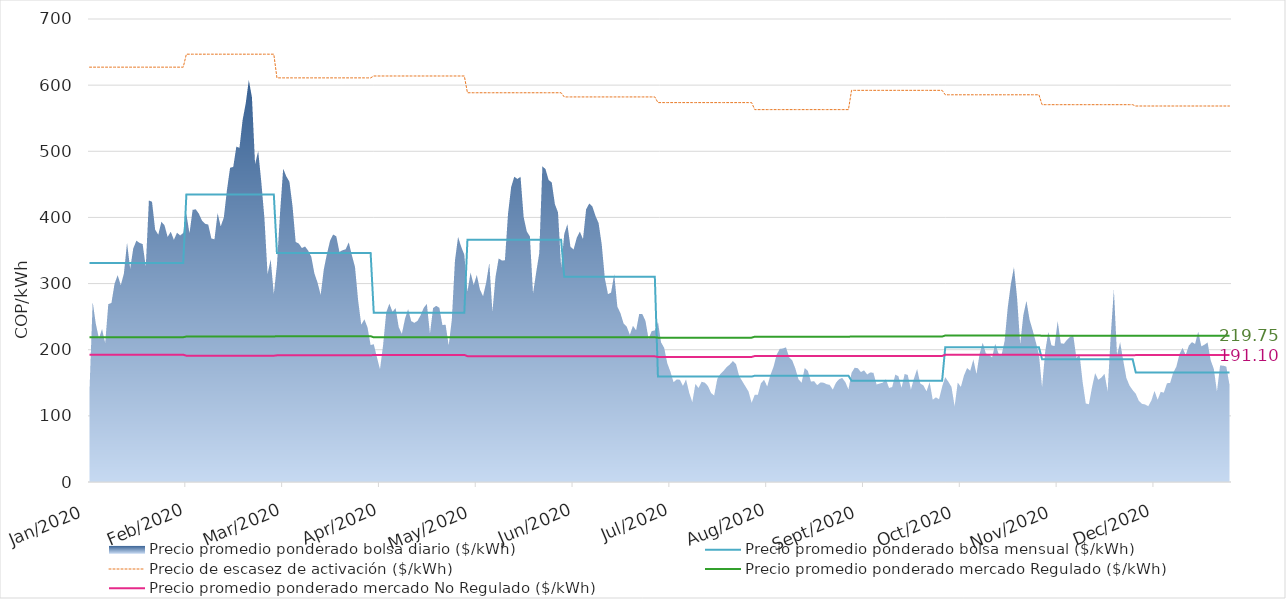
| Category | Precio promedio ponderado bolsa mensual ($/kWh) | Precio de escasez de activación ($/kWh) | Precio promedio ponderado mercado Regulado ($/kWh) | Precio promedio ponderado mercado No Regulado ($/kWh) |
|---|---|---|---|---|
| 2020-01-01 | 331.207 | 627.213 | 218.91 | 192.425 |
| 2020-01-02 | 331.207 | 627.213 | 218.91 | 192.425 |
| 2020-01-03 | 331.207 | 627.213 | 218.91 | 192.425 |
| 2020-01-04 | 331.207 | 627.213 | 218.91 | 192.425 |
| 2020-01-05 | 331.207 | 627.213 | 218.91 | 192.425 |
| 2020-01-06 | 331.207 | 627.213 | 218.91 | 192.425 |
| 2020-01-07 | 331.207 | 627.213 | 218.91 | 192.425 |
| 2020-01-08 | 331.207 | 627.213 | 218.91 | 192.425 |
| 2020-01-09 | 331.207 | 627.213 | 218.91 | 192.425 |
| 2020-01-10 | 331.207 | 627.213 | 218.91 | 192.425 |
| 2020-01-11 | 331.207 | 627.213 | 218.91 | 192.425 |
| 2020-01-12 | 331.207 | 627.213 | 218.91 | 192.425 |
| 2020-01-13 | 331.207 | 627.213 | 218.91 | 192.425 |
| 2020-01-14 | 331.207 | 627.213 | 218.91 | 192.425 |
| 2020-01-15 | 331.207 | 627.213 | 218.91 | 192.425 |
| 2020-01-16 | 331.207 | 627.213 | 218.91 | 192.425 |
| 2020-01-17 | 331.207 | 627.213 | 218.91 | 192.425 |
| 2020-01-18 | 331.207 | 627.213 | 218.91 | 192.425 |
| 2020-01-19 | 331.207 | 627.213 | 218.91 | 192.425 |
| 2020-01-20 | 331.207 | 627.213 | 218.91 | 192.425 |
| 2020-01-21 | 331.207 | 627.213 | 218.91 | 192.425 |
| 2020-01-22 | 331.207 | 627.213 | 218.91 | 192.425 |
| 2020-01-23 | 331.207 | 627.213 | 218.91 | 192.425 |
| 2020-01-24 | 331.207 | 627.213 | 218.91 | 192.425 |
| 2020-01-25 | 331.207 | 627.213 | 218.91 | 192.425 |
| 2020-01-26 | 331.207 | 627.213 | 218.91 | 192.425 |
| 2020-01-27 | 331.207 | 627.213 | 218.91 | 192.425 |
| 2020-01-28 | 331.207 | 627.213 | 218.91 | 192.425 |
| 2020-01-29 | 331.207 | 627.213 | 218.91 | 192.425 |
| 2020-01-30 | 331.207 | 627.213 | 218.91 | 192.425 |
| 2020-01-31 | 331.207 | 627.213 | 218.91 | 192.425 |
| 2020-02-01 | 434.768 | 646.808 | 219.941 | 190.929 |
| 2020-02-02 | 434.768 | 646.808 | 219.941 | 190.929 |
| 2020-02-03 | 434.768 | 646.808 | 219.941 | 190.929 |
| 2020-02-04 | 434.768 | 646.808 | 219.941 | 190.929 |
| 2020-02-05 | 434.768 | 646.808 | 219.941 | 190.929 |
| 2020-02-06 | 434.768 | 646.808 | 219.941 | 190.929 |
| 2020-02-07 | 434.768 | 646.808 | 219.941 | 190.929 |
| 2020-02-08 | 434.768 | 646.808 | 219.941 | 190.929 |
| 2020-02-09 | 434.768 | 646.808 | 219.941 | 190.929 |
| 2020-02-10 | 434.768 | 646.808 | 219.941 | 190.929 |
| 2020-02-11 | 434.768 | 646.808 | 219.941 | 190.929 |
| 2020-02-12 | 434.768 | 646.808 | 219.941 | 190.929 |
| 2020-02-13 | 434.768 | 646.808 | 219.941 | 190.929 |
| 2020-02-14 | 434.768 | 646.808 | 219.941 | 190.929 |
| 2020-02-15 | 434.768 | 646.808 | 219.941 | 190.929 |
| 2020-02-16 | 434.768 | 646.808 | 219.941 | 190.929 |
| 2020-02-17 | 434.768 | 646.808 | 219.941 | 190.929 |
| 2020-02-18 | 434.768 | 646.808 | 219.941 | 190.929 |
| 2020-02-19 | 434.768 | 646.808 | 219.941 | 190.929 |
| 2020-02-20 | 434.768 | 646.808 | 219.941 | 190.929 |
| 2020-02-21 | 434.768 | 646.808 | 219.941 | 190.929 |
| 2020-02-22 | 434.768 | 646.808 | 219.941 | 190.929 |
| 2020-02-23 | 434.768 | 646.808 | 219.941 | 190.929 |
| 2020-02-24 | 434.768 | 646.808 | 219.941 | 190.929 |
| 2020-02-25 | 434.768 | 646.808 | 219.941 | 190.929 |
| 2020-02-26 | 434.768 | 646.808 | 219.941 | 190.929 |
| 2020-02-27 | 434.768 | 646.808 | 219.941 | 190.929 |
| 2020-02-28 | 434.768 | 646.808 | 219.941 | 190.929 |
| 2020-02-29 | 434.768 | 646.808 | 219.941 | 190.929 |
| 2020-03-01 | 346.266 | 610.972 | 220.475 | 191.505 |
| 2020-03-02 | 346.266 | 610.972 | 220.475 | 191.505 |
| 2020-03-03 | 346.266 | 610.972 | 220.475 | 191.505 |
| 2020-03-04 | 346.266 | 610.972 | 220.475 | 191.505 |
| 2020-03-05 | 346.266 | 610.972 | 220.475 | 191.505 |
| 2020-03-06 | 346.266 | 610.972 | 220.475 | 191.505 |
| 2020-03-07 | 346.266 | 610.972 | 220.475 | 191.505 |
| 2020-03-08 | 346.266 | 610.972 | 220.475 | 191.505 |
| 2020-03-09 | 346.266 | 610.972 | 220.475 | 191.505 |
| 2020-03-10 | 346.266 | 610.972 | 220.475 | 191.505 |
| 2020-03-11 | 346.266 | 610.972 | 220.475 | 191.505 |
| 2020-03-12 | 346.266 | 610.972 | 220.475 | 191.505 |
| 2020-03-13 | 346.266 | 610.972 | 220.475 | 191.505 |
| 2020-03-14 | 346.266 | 610.972 | 220.475 | 191.505 |
| 2020-03-15 | 346.266 | 610.972 | 220.475 | 191.505 |
| 2020-03-16 | 346.266 | 610.972 | 220.475 | 191.505 |
| 2020-03-17 | 346.266 | 610.972 | 220.475 | 191.505 |
| 2020-03-18 | 346.266 | 610.972 | 220.475 | 191.505 |
| 2020-03-19 | 346.266 | 610.972 | 220.475 | 191.505 |
| 2020-03-20 | 346.266 | 610.972 | 220.475 | 191.505 |
| 2020-03-21 | 346.266 | 610.972 | 220.475 | 191.505 |
| 2020-03-22 | 346.266 | 610.972 | 220.475 | 191.505 |
| 2020-03-23 | 346.266 | 610.972 | 220.475 | 191.505 |
| 2020-03-24 | 346.266 | 610.972 | 220.475 | 191.505 |
| 2020-03-25 | 346.266 | 610.972 | 220.475 | 191.505 |
| 2020-03-26 | 346.266 | 610.972 | 220.475 | 191.505 |
| 2020-03-27 | 346.266 | 610.972 | 220.475 | 191.505 |
| 2020-03-28 | 346.266 | 610.972 | 220.475 | 191.505 |
| 2020-03-29 | 346.266 | 610.972 | 220.475 | 191.505 |
| 2020-03-30 | 346.266 | 610.972 | 220.475 | 191.505 |
| 2020-03-31 | 346.266 | 610.972 | 220.475 | 191.505 |
| 2020-04-01 | 255.809 | 613.837 | 218.713 | 192.19 |
| 2020-04-02 | 255.809 | 613.837 | 218.713 | 192.19 |
| 2020-04-03 | 255.809 | 613.837 | 218.713 | 192.19 |
| 2020-04-04 | 255.809 | 613.837 | 218.713 | 192.19 |
| 2020-04-05 | 255.809 | 613.837 | 218.713 | 192.19 |
| 2020-04-06 | 255.809 | 613.837 | 218.713 | 192.19 |
| 2020-04-07 | 255.809 | 613.837 | 218.713 | 192.19 |
| 2020-04-08 | 255.809 | 613.837 | 218.713 | 192.19 |
| 2020-04-09 | 255.809 | 613.837 | 218.713 | 192.19 |
| 2020-04-10 | 255.809 | 613.837 | 218.713 | 192.19 |
| 2020-04-11 | 255.809 | 613.837 | 218.713 | 192.19 |
| 2020-04-12 | 255.809 | 613.837 | 218.713 | 192.19 |
| 2020-04-13 | 255.809 | 613.837 | 218.713 | 192.19 |
| 2020-04-14 | 255.809 | 613.837 | 218.713 | 192.19 |
| 2020-04-15 | 255.809 | 613.837 | 218.713 | 192.19 |
| 2020-04-16 | 255.809 | 613.837 | 218.713 | 192.19 |
| 2020-04-17 | 255.809 | 613.837 | 218.713 | 192.19 |
| 2020-04-18 | 255.809 | 613.837 | 218.713 | 192.19 |
| 2020-04-19 | 255.809 | 613.837 | 218.713 | 192.19 |
| 2020-04-20 | 255.809 | 613.837 | 218.713 | 192.19 |
| 2020-04-21 | 255.809 | 613.837 | 218.713 | 192.19 |
| 2020-04-22 | 255.809 | 613.837 | 218.713 | 192.19 |
| 2020-04-23 | 255.809 | 613.837 | 218.713 | 192.19 |
| 2020-04-24 | 255.809 | 613.837 | 218.713 | 192.19 |
| 2020-04-25 | 255.809 | 613.837 | 218.713 | 192.19 |
| 2020-04-26 | 255.809 | 613.837 | 218.713 | 192.19 |
| 2020-04-27 | 255.809 | 613.837 | 218.713 | 192.19 |
| 2020-04-28 | 255.809 | 613.837 | 218.713 | 192.19 |
| 2020-04-29 | 255.809 | 613.837 | 218.713 | 192.19 |
| 2020-04-30 | 255.809 | 613.837 | 218.713 | 192.19 |
| 2020-05-01 | 366.393 | 588.481 | 218.769 | 190.274 |
| 2020-05-02 | 366.393 | 588.481 | 218.769 | 190.274 |
| 2020-05-03 | 366.393 | 588.481 | 218.769 | 190.274 |
| 2020-05-04 | 366.393 | 588.481 | 218.769 | 190.274 |
| 2020-05-05 | 366.393 | 588.481 | 218.769 | 190.274 |
| 2020-05-06 | 366.393 | 588.481 | 218.769 | 190.274 |
| 2020-05-07 | 366.393 | 588.481 | 218.769 | 190.274 |
| 2020-05-08 | 366.393 | 588.481 | 218.769 | 190.274 |
| 2020-05-09 | 366.393 | 588.481 | 218.769 | 190.274 |
| 2020-05-10 | 366.393 | 588.481 | 218.769 | 190.274 |
| 2020-05-11 | 366.393 | 588.481 | 218.769 | 190.274 |
| 2020-05-12 | 366.393 | 588.481 | 218.769 | 190.274 |
| 2020-05-13 | 366.393 | 588.481 | 218.769 | 190.274 |
| 2020-05-14 | 366.393 | 588.481 | 218.769 | 190.274 |
| 2020-05-15 | 366.393 | 588.481 | 218.769 | 190.274 |
| 2020-05-16 | 366.393 | 588.481 | 218.769 | 190.274 |
| 2020-05-17 | 366.393 | 588.481 | 218.769 | 190.274 |
| 2020-05-18 | 366.393 | 588.481 | 218.769 | 190.274 |
| 2020-05-19 | 366.393 | 588.481 | 218.769 | 190.274 |
| 2020-05-20 | 366.393 | 588.481 | 218.769 | 190.274 |
| 2020-05-21 | 366.393 | 588.481 | 218.769 | 190.274 |
| 2020-05-22 | 366.393 | 588.481 | 218.769 | 190.274 |
| 2020-05-23 | 366.393 | 588.481 | 218.769 | 190.274 |
| 2020-05-24 | 366.393 | 588.481 | 218.769 | 190.274 |
| 2020-05-25 | 366.393 | 588.481 | 218.769 | 190.274 |
| 2020-05-26 | 366.393 | 588.481 | 218.769 | 190.274 |
| 2020-05-27 | 366.393 | 588.481 | 218.769 | 190.274 |
| 2020-05-28 | 366.393 | 588.481 | 218.769 | 190.274 |
| 2020-05-29 | 366.393 | 588.481 | 218.769 | 190.274 |
| 2020-05-30 | 366.393 | 588.481 | 218.769 | 190.274 |
| 2020-05-31 | 366.393 | 588.481 | 218.769 | 190.274 |
| 2020-06-01 | 310.186 | 582.191 | 218.767 | 189.962 |
| 2020-06-02 | 310.186 | 582.191 | 218.767 | 189.962 |
| 2020-06-03 | 310.186 | 582.191 | 218.767 | 189.962 |
| 2020-06-04 | 310.186 | 582.191 | 218.767 | 189.962 |
| 2020-06-05 | 310.186 | 582.191 | 218.767 | 189.962 |
| 2020-06-06 | 310.186 | 582.191 | 218.767 | 189.962 |
| 2020-06-07 | 310.186 | 582.191 | 218.767 | 189.962 |
| 2020-06-08 | 310.186 | 582.191 | 218.767 | 189.962 |
| 2020-06-09 | 310.186 | 582.191 | 218.767 | 189.962 |
| 2020-06-10 | 310.186 | 582.191 | 218.767 | 189.962 |
| 2020-06-11 | 310.186 | 582.191 | 218.767 | 189.962 |
| 2020-06-12 | 310.186 | 582.191 | 218.767 | 189.962 |
| 2020-06-13 | 310.186 | 582.191 | 218.767 | 189.962 |
| 2020-06-14 | 310.186 | 582.191 | 218.767 | 189.962 |
| 2020-06-15 | 310.186 | 582.191 | 218.767 | 189.962 |
| 2020-06-16 | 310.186 | 582.191 | 218.767 | 189.962 |
| 2020-06-17 | 310.186 | 582.191 | 218.767 | 189.962 |
| 2020-06-18 | 310.186 | 582.191 | 218.767 | 189.962 |
| 2020-06-19 | 310.186 | 582.191 | 218.767 | 189.962 |
| 2020-06-20 | 310.186 | 582.191 | 218.767 | 189.962 |
| 2020-06-21 | 310.186 | 582.191 | 218.767 | 189.962 |
| 2020-06-22 | 310.186 | 582.191 | 218.767 | 189.962 |
| 2020-06-23 | 310.186 | 582.191 | 218.767 | 189.962 |
| 2020-06-24 | 310.186 | 582.191 | 218.767 | 189.962 |
| 2020-06-25 | 310.186 | 582.191 | 218.767 | 189.962 |
| 2020-06-26 | 310.186 | 582.191 | 218.767 | 189.962 |
| 2020-06-27 | 310.186 | 582.191 | 218.767 | 189.962 |
| 2020-06-28 | 310.186 | 582.191 | 218.767 | 189.962 |
| 2020-06-29 | 310.186 | 582.191 | 218.767 | 189.962 |
| 2020-06-30 | 310.186 | 582.191 | 218.767 | 189.962 |
| 2020-07-01 | 159.333 | 573.611 | 218.269 | 189.088 |
| 2020-07-02 | 159.333 | 573.611 | 218.269 | 189.088 |
| 2020-07-03 | 159.333 | 573.611 | 218.269 | 189.088 |
| 2020-07-04 | 159.333 | 573.611 | 218.269 | 189.088 |
| 2020-07-05 | 159.333 | 573.611 | 218.269 | 189.088 |
| 2020-07-06 | 159.333 | 573.611 | 218.269 | 189.088 |
| 2020-07-07 | 159.333 | 573.611 | 218.269 | 189.088 |
| 2020-07-08 | 159.333 | 573.611 | 218.269 | 189.088 |
| 2020-07-09 | 159.333 | 573.611 | 218.269 | 189.088 |
| 2020-07-10 | 159.333 | 573.611 | 218.269 | 189.088 |
| 2020-07-11 | 159.333 | 573.611 | 218.269 | 189.088 |
| 2020-07-12 | 159.333 | 573.611 | 218.269 | 189.088 |
| 2020-07-13 | 159.333 | 573.611 | 218.269 | 189.088 |
| 2020-07-14 | 159.333 | 573.611 | 218.269 | 189.088 |
| 2020-07-15 | 159.333 | 573.611 | 218.269 | 189.088 |
| 2020-07-16 | 159.333 | 573.611 | 218.269 | 189.088 |
| 2020-07-17 | 159.333 | 573.611 | 218.269 | 189.088 |
| 2020-07-18 | 159.333 | 573.611 | 218.269 | 189.088 |
| 2020-07-19 | 159.333 | 573.611 | 218.269 | 189.088 |
| 2020-07-20 | 159.333 | 573.611 | 218.269 | 189.088 |
| 2020-07-21 | 159.333 | 573.611 | 218.269 | 189.088 |
| 2020-07-22 | 159.333 | 573.611 | 218.269 | 189.088 |
| 2020-07-23 | 159.333 | 573.611 | 218.269 | 189.088 |
| 2020-07-24 | 159.333 | 573.611 | 218.269 | 189.088 |
| 2020-07-25 | 159.333 | 573.611 | 218.269 | 189.088 |
| 2020-07-26 | 159.333 | 573.611 | 218.269 | 189.088 |
| 2020-07-27 | 159.333 | 573.611 | 218.269 | 189.088 |
| 2020-07-28 | 159.333 | 573.611 | 218.269 | 189.088 |
| 2020-07-29 | 159.333 | 573.611 | 218.269 | 189.088 |
| 2020-07-30 | 159.333 | 573.611 | 218.269 | 189.088 |
| 2020-07-31 | 159.333 | 573.611 | 218.269 | 189.088 |
| 2020-08-01 | 160.719 | 562.998 | 219.631 | 190.429 |
| 2020-08-02 | 160.719 | 562.998 | 219.631 | 190.429 |
| 2020-08-03 | 160.719 | 562.998 | 219.631 | 190.429 |
| 2020-08-04 | 160.719 | 562.998 | 219.631 | 190.429 |
| 2020-08-05 | 160.719 | 562.998 | 219.631 | 190.429 |
| 2020-08-06 | 160.719 | 562.998 | 219.631 | 190.429 |
| 2020-08-07 | 160.719 | 562.998 | 219.631 | 190.429 |
| 2020-08-08 | 160.719 | 562.998 | 219.631 | 190.429 |
| 2020-08-09 | 160.719 | 562.998 | 219.631 | 190.429 |
| 2020-08-10 | 160.719 | 562.998 | 219.631 | 190.429 |
| 2020-08-11 | 160.719 | 562.998 | 219.631 | 190.429 |
| 2020-08-12 | 160.719 | 562.998 | 219.631 | 190.429 |
| 2020-08-13 | 160.719 | 562.998 | 219.631 | 190.429 |
| 2020-08-14 | 160.719 | 562.998 | 219.631 | 190.429 |
| 2020-08-15 | 160.719 | 562.998 | 219.631 | 190.429 |
| 2020-08-16 | 160.719 | 562.998 | 219.631 | 190.429 |
| 2020-08-17 | 160.719 | 562.998 | 219.631 | 190.429 |
| 2020-08-18 | 160.719 | 562.998 | 219.631 | 190.429 |
| 2020-08-19 | 160.719 | 562.998 | 219.631 | 190.429 |
| 2020-08-20 | 160.719 | 562.998 | 219.631 | 190.429 |
| 2020-08-21 | 160.719 | 562.998 | 219.631 | 190.429 |
| 2020-08-22 | 160.719 | 562.998 | 219.631 | 190.429 |
| 2020-08-23 | 160.719 | 562.998 | 219.631 | 190.429 |
| 2020-08-24 | 160.719 | 562.998 | 219.631 | 190.429 |
| 2020-08-25 | 160.719 | 562.998 | 219.631 | 190.429 |
| 2020-08-26 | 160.719 | 562.998 | 219.631 | 190.429 |
| 2020-08-27 | 160.719 | 562.998 | 219.631 | 190.429 |
| 2020-08-28 | 160.719 | 562.998 | 219.631 | 190.429 |
| 2020-08-29 | 160.719 | 562.998 | 219.631 | 190.429 |
| 2020-08-30 | 160.719 | 562.998 | 219.631 | 190.429 |
| 2020-08-31 | 160.719 | 562.998 | 219.631 | 190.429 |
| 2020-09-01 | 153.098 | 592.158 | 219.967 | 190.528 |
| 2020-09-02 | 153.098 | 592.158 | 219.967 | 190.528 |
| 2020-09-03 | 153.098 | 592.158 | 219.967 | 190.528 |
| 2020-09-04 | 153.098 | 592.158 | 219.967 | 190.528 |
| 2020-09-05 | 153.098 | 592.158 | 219.967 | 190.528 |
| 2020-09-06 | 153.098 | 592.158 | 219.967 | 190.528 |
| 2020-09-07 | 153.098 | 592.158 | 219.967 | 190.528 |
| 2020-09-08 | 153.098 | 592.158 | 219.967 | 190.528 |
| 2020-09-09 | 153.098 | 592.158 | 219.967 | 190.528 |
| 2020-09-10 | 153.098 | 592.158 | 219.967 | 190.528 |
| 2020-09-11 | 153.098 | 592.158 | 219.967 | 190.528 |
| 2020-09-12 | 153.098 | 592.158 | 219.967 | 190.528 |
| 2020-09-13 | 153.098 | 592.158 | 219.967 | 190.528 |
| 2020-09-14 | 153.098 | 592.158 | 219.967 | 190.528 |
| 2020-09-15 | 153.098 | 592.158 | 219.967 | 190.528 |
| 2020-09-16 | 153.098 | 592.158 | 219.967 | 190.528 |
| 2020-09-17 | 153.098 | 592.158 | 219.967 | 190.528 |
| 2020-09-18 | 153.098 | 592.158 | 219.967 | 190.528 |
| 2020-09-19 | 153.098 | 592.158 | 219.967 | 190.528 |
| 2020-09-20 | 153.098 | 592.158 | 219.967 | 190.528 |
| 2020-09-21 | 153.098 | 592.158 | 219.967 | 190.528 |
| 2020-09-22 | 153.098 | 592.158 | 219.967 | 190.528 |
| 2020-09-23 | 153.098 | 592.158 | 219.967 | 190.528 |
| 2020-09-24 | 153.098 | 592.158 | 219.967 | 190.528 |
| 2020-09-25 | 153.098 | 592.158 | 219.967 | 190.528 |
| 2020-09-26 | 153.098 | 592.158 | 219.967 | 190.528 |
| 2020-09-27 | 153.098 | 592.158 | 219.967 | 190.528 |
| 2020-09-28 | 153.098 | 592.158 | 219.967 | 190.528 |
| 2020-09-29 | 153.098 | 592.158 | 219.967 | 190.528 |
| 2020-09-30 | 153.098 | 592.158 | 219.967 | 190.528 |
| 2020-10-01 | 203.583 | 585.407 | 221.477 | 192.355 |
| 2020-10-02 | 203.583 | 585.407 | 221.477 | 192.355 |
| 2020-10-03 | 203.583 | 585.407 | 221.477 | 192.355 |
| 2020-10-04 | 203.583 | 585.407 | 221.477 | 192.355 |
| 2020-10-05 | 203.583 | 585.407 | 221.477 | 192.355 |
| 2020-10-06 | 203.583 | 585.407 | 221.477 | 192.355 |
| 2020-10-07 | 203.583 | 585.407 | 221.477 | 192.355 |
| 2020-10-08 | 203.583 | 585.407 | 221.477 | 192.355 |
| 2020-10-09 | 203.583 | 585.407 | 221.477 | 192.355 |
| 2020-10-10 | 203.583 | 585.407 | 221.477 | 192.355 |
| 2020-10-11 | 203.583 | 585.407 | 221.477 | 192.355 |
| 2020-10-12 | 203.583 | 585.407 | 221.477 | 192.355 |
| 2020-10-13 | 203.583 | 585.407 | 221.477 | 192.355 |
| 2020-10-14 | 203.583 | 585.407 | 221.477 | 192.355 |
| 2020-10-15 | 203.583 | 585.407 | 221.477 | 192.355 |
| 2020-10-16 | 203.583 | 585.407 | 221.477 | 192.355 |
| 2020-10-17 | 203.583 | 585.407 | 221.477 | 192.355 |
| 2020-10-18 | 203.583 | 585.407 | 221.477 | 192.355 |
| 2020-10-19 | 203.583 | 585.407 | 221.477 | 192.355 |
| 2020-10-20 | 203.583 | 585.407 | 221.477 | 192.355 |
| 2020-10-21 | 203.583 | 585.407 | 221.477 | 192.355 |
| 2020-10-22 | 203.583 | 585.407 | 221.477 | 192.355 |
| 2020-10-23 | 203.583 | 585.407 | 221.477 | 192.355 |
| 2020-10-24 | 203.583 | 585.407 | 221.477 | 192.355 |
| 2020-10-25 | 203.583 | 585.407 | 221.477 | 192.355 |
| 2020-10-26 | 203.583 | 585.407 | 221.477 | 192.355 |
| 2020-10-27 | 203.583 | 585.407 | 221.477 | 192.355 |
| 2020-10-28 | 203.583 | 585.407 | 221.477 | 192.355 |
| 2020-10-29 | 203.583 | 585.407 | 221.477 | 192.355 |
| 2020-10-30 | 203.583 | 585.407 | 221.477 | 192.355 |
| 2020-10-31 | 203.583 | 585.407 | 221.477 | 192.355 |
| 2020-11-01 | 185.605 | 570.461 | 221.142 | 191.604 |
| 2020-11-02 | 185.605 | 570.461 | 221.142 | 191.604 |
| 2020-11-03 | 185.605 | 570.461 | 221.142 | 191.604 |
| 2020-11-04 | 185.605 | 570.461 | 221.142 | 191.604 |
| 2020-11-05 | 185.605 | 570.461 | 221.142 | 191.604 |
| 2020-11-06 | 185.605 | 570.461 | 221.142 | 191.604 |
| 2020-11-07 | 185.605 | 570.461 | 221.142 | 191.604 |
| 2020-11-08 | 185.605 | 570.461 | 221.142 | 191.604 |
| 2020-11-09 | 185.605 | 570.461 | 221.142 | 191.604 |
| 2020-11-10 | 185.605 | 570.461 | 221.142 | 191.604 |
| 2020-11-11 | 185.605 | 570.461 | 221.142 | 191.604 |
| 2020-11-12 | 185.605 | 570.461 | 221.142 | 191.604 |
| 2020-11-13 | 185.605 | 570.461 | 221.142 | 191.604 |
| 2020-11-14 | 185.605 | 570.461 | 221.142 | 191.604 |
| 2020-11-15 | 185.605 | 570.461 | 221.142 | 191.604 |
| 2020-11-16 | 185.605 | 570.461 | 221.142 | 191.604 |
| 2020-11-17 | 185.605 | 570.461 | 221.142 | 191.604 |
| 2020-11-18 | 185.605 | 570.461 | 221.142 | 191.604 |
| 2020-11-19 | 185.605 | 570.461 | 221.142 | 191.604 |
| 2020-11-20 | 185.605 | 570.461 | 221.142 | 191.604 |
| 2020-11-21 | 185.605 | 570.461 | 221.142 | 191.604 |
| 2020-11-22 | 185.605 | 570.461 | 221.142 | 191.604 |
| 2020-11-23 | 185.605 | 570.461 | 221.142 | 191.604 |
| 2020-11-24 | 185.605 | 570.461 | 221.142 | 191.604 |
| 2020-11-25 | 185.605 | 570.461 | 221.142 | 191.604 |
| 2020-11-26 | 185.605 | 570.461 | 221.142 | 191.604 |
| 2020-11-27 | 185.605 | 570.461 | 221.142 | 191.604 |
| 2020-11-28 | 185.605 | 570.461 | 221.142 | 191.604 |
| 2020-11-29 | 185.605 | 570.461 | 221.142 | 191.604 |
| 2020-11-30 | 185.605 | 570.461 | 221.142 | 191.604 |
| 2020-12-01 | 165.646 | 568.457 | 220.97 | 191.865 |
| 2020-12-02 | 165.646 | 568.457 | 220.97 | 191.865 |
| 2020-12-03 | 165.646 | 568.457 | 220.97 | 191.865 |
| 2020-12-04 | 165.646 | 568.457 | 220.97 | 191.865 |
| 2020-12-05 | 165.646 | 568.457 | 220.97 | 191.865 |
| 2020-12-06 | 165.646 | 568.457 | 220.97 | 191.865 |
| 2020-12-07 | 165.646 | 568.457 | 220.97 | 191.865 |
| 2020-12-08 | 165.646 | 568.457 | 220.97 | 191.865 |
| 2020-12-09 | 165.646 | 568.457 | 220.97 | 191.865 |
| 2020-12-10 | 165.646 | 568.457 | 220.97 | 191.865 |
| 2020-12-11 | 165.646 | 568.457 | 220.97 | 191.865 |
| 2020-12-12 | 165.646 | 568.457 | 220.97 | 191.865 |
| 2020-12-13 | 165.646 | 568.457 | 220.97 | 191.865 |
| 2020-12-14 | 165.646 | 568.457 | 220.97 | 191.865 |
| 2020-12-15 | 165.646 | 568.457 | 220.97 | 191.865 |
| 2020-12-16 | 165.646 | 568.457 | 220.97 | 191.865 |
| 2020-12-17 | 165.646 | 568.457 | 220.97 | 191.865 |
| 2020-12-18 | 165.646 | 568.457 | 220.97 | 191.865 |
| 2020-12-19 | 165.646 | 568.457 | 220.97 | 191.865 |
| 2020-12-20 | 165.646 | 568.457 | 220.97 | 191.865 |
| 2020-12-21 | 165.646 | 568.457 | 220.97 | 191.865 |
| 2020-12-22 | 165.646 | 568.457 | 220.97 | 191.865 |
| 2020-12-23 | 165.646 | 568.457 | 220.97 | 191.865 |
| 2020-12-24 | 165.646 | 568.457 | 220.97 | 191.865 |
| 2020-12-25 | 165.646 | 568.457 | 220.97 | 191.865 |
| 2020-12-26 | 165.646 | 568.457 | 220.97 | 191.865 |
| 2020-12-27 | 165.646 | 568.457 | 220.97 | 191.865 |
| 2020-12-28 | 165.646 | 568.457 | 220.97 | 191.865 |
| 2020-12-29 | 165.646 | 568.457 | 220.97 | 191.865 |
| 2020-12-30 | 165.646 | 568.457 | 220.97 | 191.865 |
| 2020-12-31 | 165.646 | 568.457 | 220.97 | 191.865 |